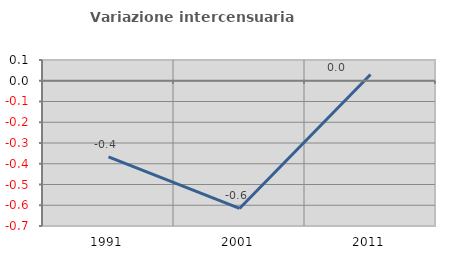
| Category | Variazione intercensuaria annua |
|---|---|
| 1991.0 | -0.367 |
| 2001.0 | -0.615 |
| 2011.0 | 0.03 |